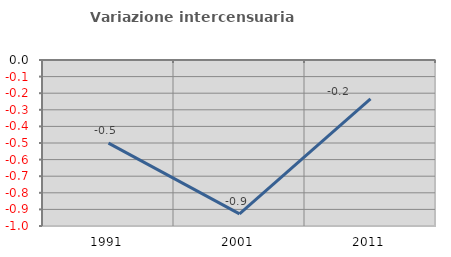
| Category | Variazione intercensuaria annua |
|---|---|
| 1991.0 | -0.5 |
| 2001.0 | -0.927 |
| 2011.0 | -0.234 |